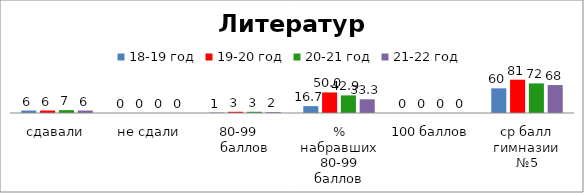
| Category | 18-19 год | 19-20 год | 20-21 год | 21-22 год |
|---|---|---|---|---|
| сдавали | 6 | 6 | 7 | 6 |
| не сдали | 0 | 0 | 0 | 0 |
| 80-99    баллов | 1 | 3 | 3 | 2 |
| % набравших 80-99 баллов | 16.667 | 50 | 42.857 | 33.333 |
| 100 баллов | 0 | 0 | 0 | 0 |
| ср балл гимназии №5 | 60 | 81 | 72 | 68 |